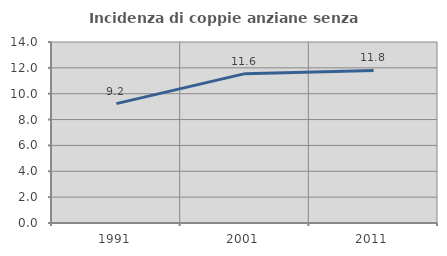
| Category | Incidenza di coppie anziane senza figli  |
|---|---|
| 1991.0 | 9.236 |
| 2001.0 | 11.553 |
| 2011.0 | 11.8 |